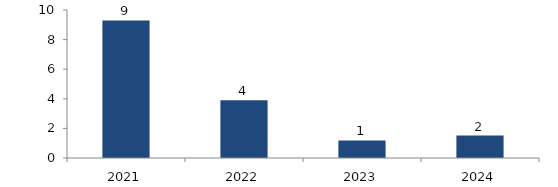
| Category | Bogotá |
|---|---|
| 2021.0 | 9.292 |
| 2022.0 | 3.903 |
| 2023.0 | 1.182 |
| 2024.0 | 1.517 |